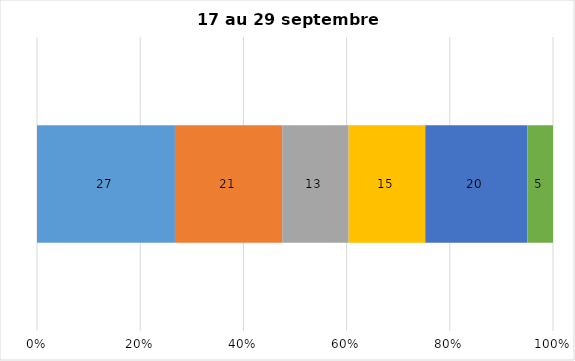
| Category | Plusieurs fois par jour | Une fois par jour | Quelques fois par semaine   | Une fois par semaine ou moins   |  Jamais   |  Je n’utilise pas les médias sociaux |
|---|---|---|---|---|---|---|
| 0 | 27 | 21 | 13 | 15 | 20 | 5 |